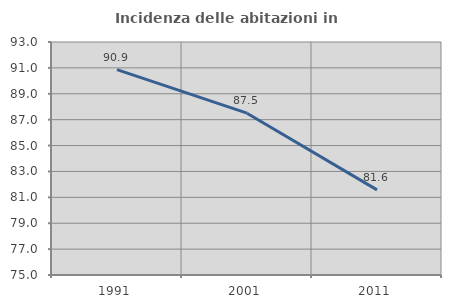
| Category | Incidenza delle abitazioni in proprietà  |
|---|---|
| 1991.0 | 90.86 |
| 2001.0 | 87.5 |
| 2011.0 | 81.579 |